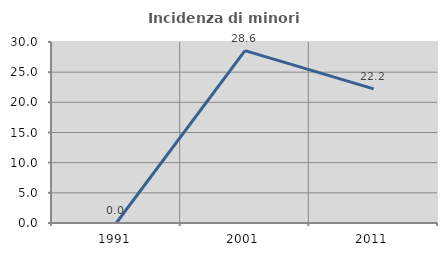
| Category | Incidenza di minori stranieri |
|---|---|
| 1991.0 | 0 |
| 2001.0 | 28.571 |
| 2011.0 | 22.222 |